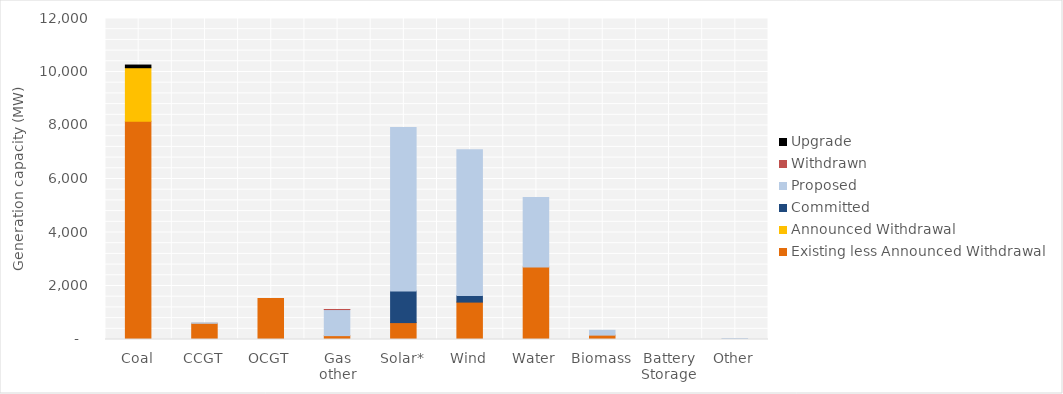
| Category | Existing less Announced Withdrawal | Announced Withdrawal | Committed | Proposed | Withdrawn | Upgrade |
|---|---|---|---|---|---|---|
| Coal | 8160 | 2000 | 0 | 0 | 0 | 100 |
| CCGT | 605.9 | 0 | 0 | 15 | 0 | 0 |
| OCGT | 1530 | 0 | 0 | 0 | 0 | 0 |
| Gas other | 144.46 | 0 | 0 | 975 | 2.8 | 0 |
| Solar* | 632.023 | 0 | 1180.4 | 6109.3 | 0 | 0 |
| Wind | 1398 | 0 | 248.19 | 5446.69 | 0 | 0 |
| Water | 2706.1 | 0 | 0 | 2600 | 0 | 0 |
| Biomass | 162.874 | 0 | 0 | 180.6 | 0 | 0 |
| Battery Storage | 0 | 0 | 0 | 0 | 0 | 0 |
| Other | 9.13 | 0 | 0 | 28.8 | 0 | 0 |